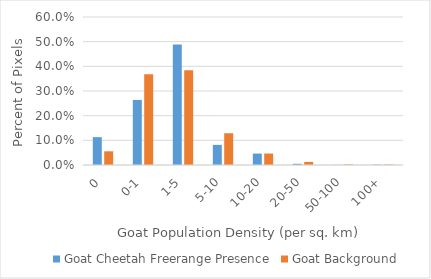
| Category | Goat Cheetah Freerange Presence | Goat Background |
|---|---|---|
| 0 | 0.113 | 0.056 |
| 0-1 | 0.264 | 0.368 |
| 1-5 | 0.489 | 0.384 |
| 5-10 | 0.082 | 0.129 |
| 10-20 | 0.046 | 0.046 |
| 20-50 | 0.005 | 0.013 |
| 50-100 | 0 | 0.002 |
| 100+ | 0.002 | 0.002 |